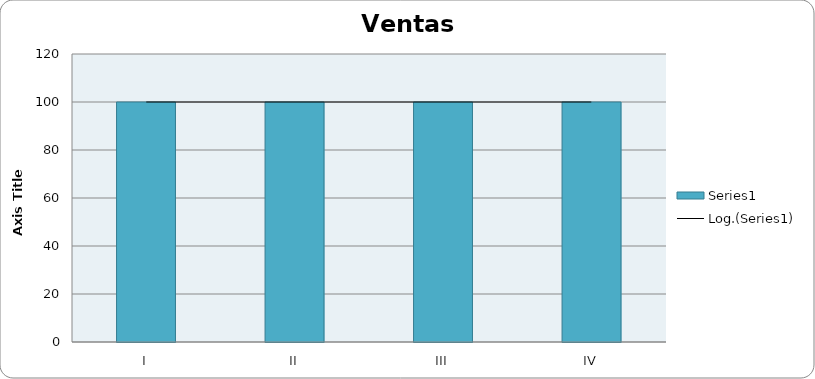
| Category | Series 0 |
|---|---|
| I | 100 |
| II | 100 |
| III | 100 |
| IV | 100 |